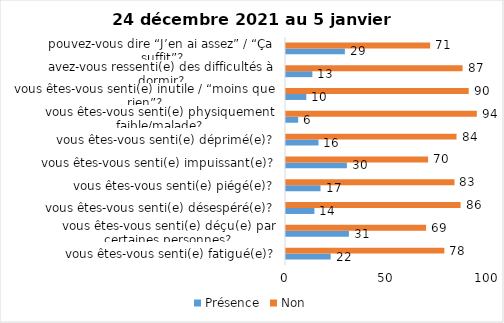
| Category | Présence | Non |
|---|---|---|
| vous êtes-vous senti(e) fatigué(e)? | 22 | 78 |
| vous êtes-vous senti(e) déçu(e) par certaines personnes? | 31 | 69 |
| vous êtes-vous senti(e) désespéré(e)? | 14 | 86 |
| vous êtes-vous senti(e) piégé(e)? | 17 | 83 |
| vous êtes-vous senti(e) impuissant(e)? | 30 | 70 |
| vous êtes-vous senti(e) déprimé(e)? | 16 | 84 |
| vous êtes-vous senti(e) physiquement faible/malade? | 6 | 94 |
| vous êtes-vous senti(e) inutile / “moins que rien”? | 10 | 90 |
| avez-vous ressenti(e) des difficultés à dormir? | 13 | 87 |
| pouvez-vous dire “J’en ai assez” / “Ça suffit”? | 29 | 71 |